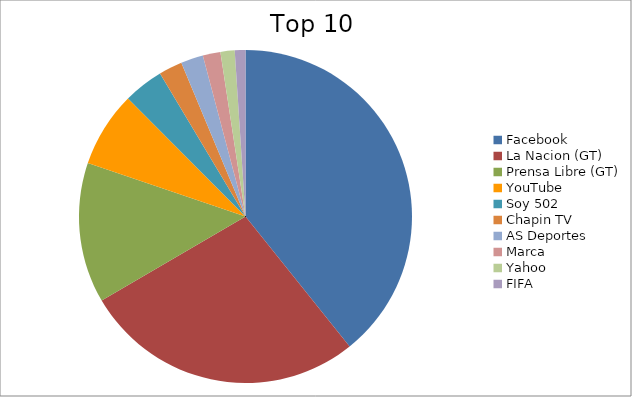
| Category | Series 0 |
|---|---|
| Facebook | 31.1 |
| La Nacion (GT) | 21.67 |
| Prensa Libre (GT) | 10.79 |
| YouTube | 5.8 |
| Soy 502 | 3.08 |
| Chapin TV | 1.81 |
| AS Deportes | 1.72 |
| Marca | 1.36 |
| Yahoo | 1.09 |
| FIFA | 0.82 |